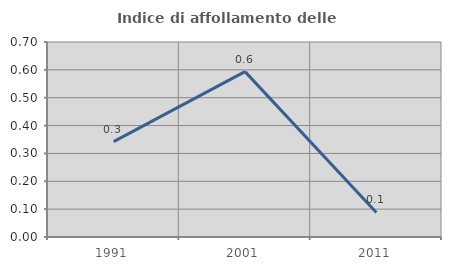
| Category | Indice di affollamento delle abitazioni  |
|---|---|
| 1991.0 | 0.342 |
| 2001.0 | 0.594 |
| 2011.0 | 0.088 |